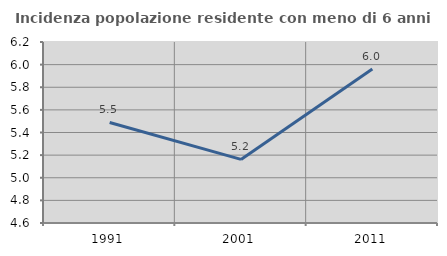
| Category | Incidenza popolazione residente con meno di 6 anni |
|---|---|
| 1991.0 | 5.489 |
| 2001.0 | 5.162 |
| 2011.0 | 5.961 |